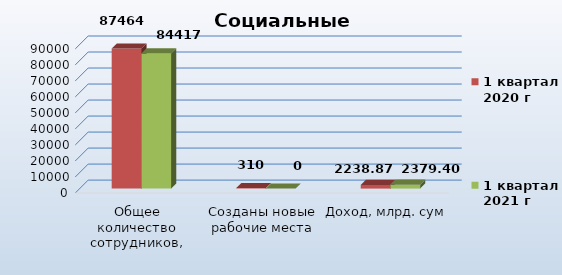
| Category | Series 0 | 1 квартал
2020 г | 1 квартал
2021 г |
|---|---|---|---|
| Общее количество сотрудников, тыс. человек |  | 87464 | 84417 |
| Созданы новые рабочие места |  | 310 | 0 |
| Доход, млрд. сум |  | 2238.872 | 2379.4 |